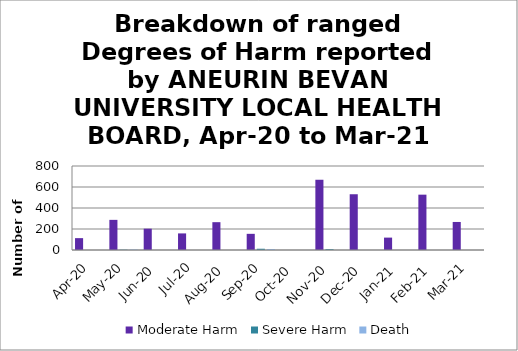
| Category | Moderate Harm | Severe Harm | Death |
|---|---|---|---|
| Apr-20 | 113 | 0 | 0 |
| May-20 | 287 | 3 | 5 |
| Jun-20 | 203 | 0 | 0 |
| Jul-20 | 158 | 0 | 0 |
| Aug-20 | 265 | 0 | 0 |
| Sep-20 | 154 | 12 | 9 |
| Oct-20 | 0 | 0 | 0 |
| Nov-20 | 669 | 8 | 0 |
| Dec-20 | 531 | 0 | 0 |
| Jan-21 | 118 | 0 | 0 |
| Feb-21 | 527 | 0 | 0 |
| Mar-21 | 267 | 0 | 0 |